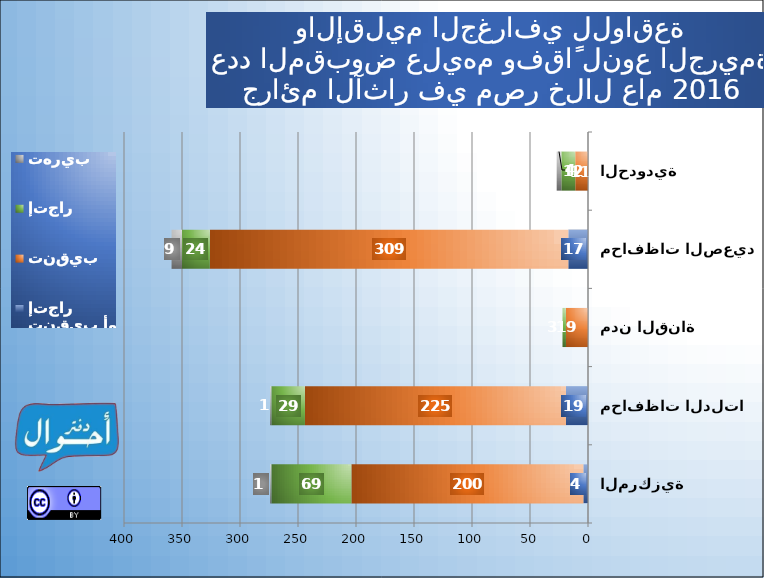
| Category | شروع في تنقيب أو إتجار | تنقيب | إتجار | تهريب |
|---|---|---|---|---|
| المحافظات المركزية | 4 | 200 | 69 | 1 |
| محافظات الدلتا | 19 | 225 | 29 | 1 |
| مدن القناة | 0 | 19 | 3 | 0 |
| محافظات الصعيد | 17 | 309 | 24 | 9 |
| المحافظات الحدودية | 0 | 11 | 12 | 4 |